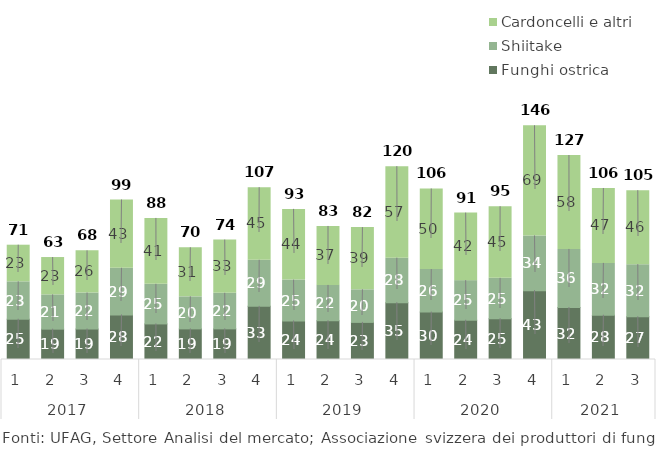
| Category | Funghi ostrica | Shiitake | Cardoncelli e altri |
|---|---|---|---|
| 0 | 25.079 | 23.265 | 22.819 |
| 1 | 18.886 | 21.334 | 23.258 |
| 2 | 18.971 | 22.42 | 26.243 |
| 3 | 27.754 | 29.034 | 42.505 |
| 4 | 22.146 | 24.677 | 41.005 |
| 5 | 19.059 | 19.94 | 30.556 |
| 6 | 19.065 | 22.163 | 33.138 |
| 7 | 33.082 | 28.698 | 45.186 |
| 8 | 24.008 | 25.417 | 44.031 |
| 9 | 24.127 | 22.004 | 36.701 |
| 10 | 23.106 | 20.279 | 38.721 |
| 11 | 35.378 | 27.707 | 56.989 |
| 12 | 29.53 | 26.447 | 50.171 |
| 13 | 24.449 | 24.65 | 42.046 |
| 14 | 25.404 | 25.13 | 44.589 |
| 15 | 42.867 | 34.053 | 68.586 |
| 16 | 32.347 | 36.183 | 58.472 |
| 17 | 27.565 | 32.275 | 46.621 |
| 18 | 26.576 | 32.478 | 46.072 |